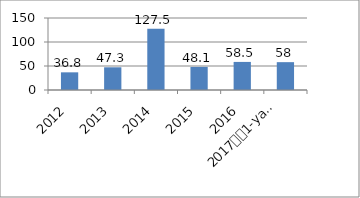
| Category | Series 0 |
|---|---|
| 2012 | 36.8 |
| 2013 | 47.3 |
| 2014 | 127.5 |
| 2015 | 48.1 |
| 2016 | 58.5 |
| 2017
1-yarim yillik | 58 |